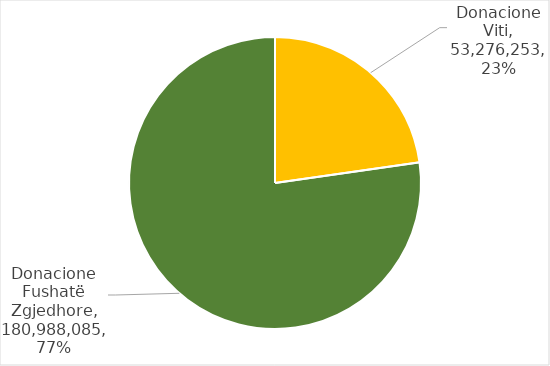
| Category | Series 0 |
|---|---|
| Donacione Viti | 53276253 |
| Donacione Fushatë Zgjedhore | 180988084.895 |